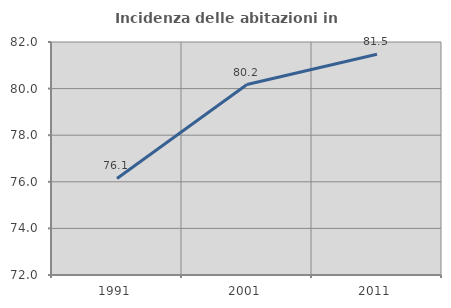
| Category | Incidenza delle abitazioni in proprietà  |
|---|---|
| 1991.0 | 76.142 |
| 2001.0 | 80.175 |
| 2011.0 | 81.474 |